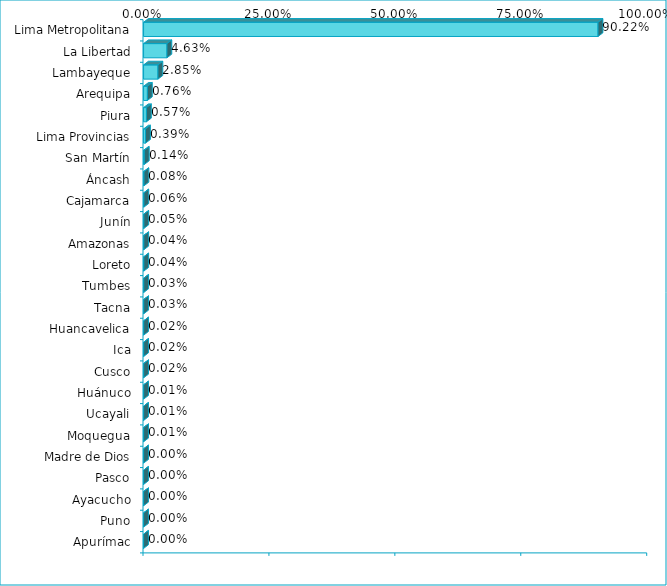
| Category | Series 0 |
|---|---|
| Lima Metropolitana | 0.902 |
| La Libertad | 0.046 |
| Lambayeque | 0.029 |
| Arequipa | 0.008 |
| Piura | 0.006 |
| Lima Provincias | 0.004 |
| San Martín | 0.001 |
| Áncash | 0.001 |
| Cajamarca | 0.001 |
| Junín | 0.001 |
| Amazonas | 0 |
| Loreto | 0 |
| Tumbes | 0 |
| Tacna | 0 |
| Huancavelica | 0 |
| Ica | 0 |
| Cusco | 0 |
| Huánuco | 0 |
| Ucayali | 0 |
| Moquegua | 0 |
| Madre de Dios | 0 |
| Pasco | 0 |
| Ayacucho | 0 |
| Puno | 0 |
| Apurímac | 0 |